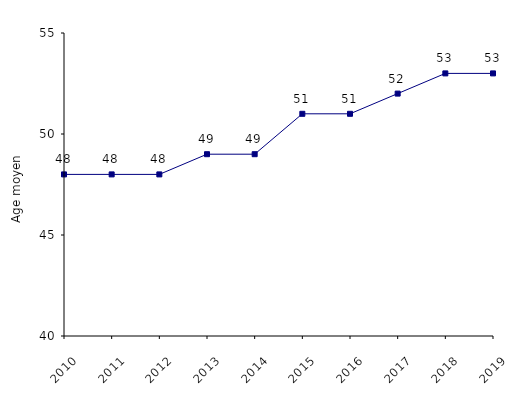
| Category | Series 0 |
|---|---|
| 2010.0 | 48 |
| 2011.0 | 48 |
| 2012.0 | 48 |
| 2013.0 | 49 |
| 2014.0 | 49 |
| 2015.0 | 51 |
| 2016.0 | 51 |
| 2017.0 | 52 |
| 2018.0 | 53 |
| 2019.0 | 53 |